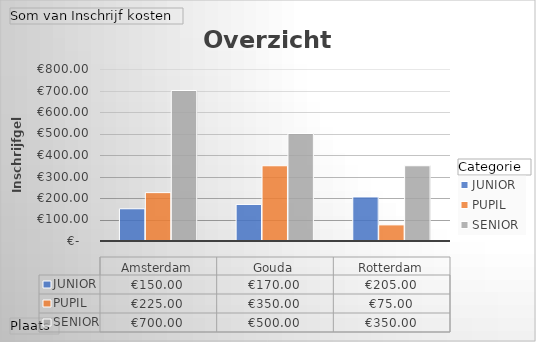
| Category | JUNIOR | PUPIL | SENIOR |
|---|---|---|---|
| Amsterdam | 150 | 225 | 700 |
| Gouda | 170 | 350 | 500 |
| Rotterdam | 205 | 75 | 350 |